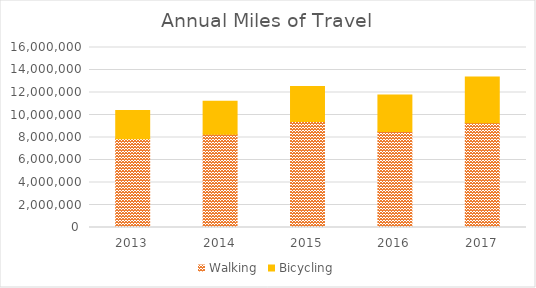
| Category | Walking | Bicycling |
|---|---|---|
| 2013 | 7878407.652 | 2517834.581 |
| 2014 | 8296988.088 | 2935051.777 |
| 2015 | 9414821.968 | 3125865.982 |
| 2016 | 8542636.68 | 3232384.224 |
| 2017 | 9318821.339 | 4048270.551 |